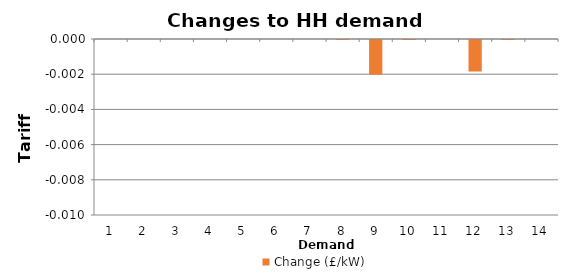
| Category | Change (£/kW) |
|---|---|
| 0 | 0 |
| 1 | 0 |
| 2 | 0 |
| 3 | 0 |
| 4 | 0 |
| 5 | 0 |
| 6 | 0 |
| 7 | 0 |
| 8 | -0.002 |
| 9 | 0 |
| 10 | 0 |
| 11 | -0.002 |
| 12 | 0 |
| 13 | 0 |